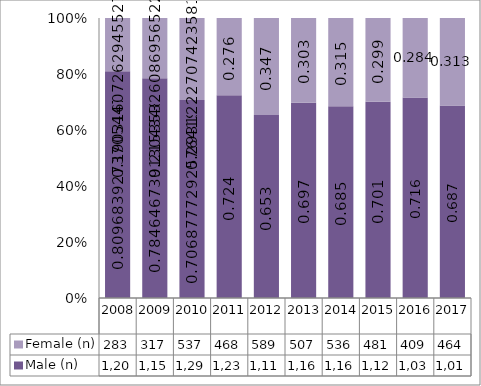
| Category | Male (n) | Female (n) |
|---|---|---|
| 2008.0 | 1204 | 283 |
| 2009.0 | 1155 | 317 |
| 2010.0 | 1295 | 537 |
| 2011.0 | 1230 | 468 |
| 2012.0 | 1110 | 589 |
| 2013.0 | 1166 | 507 |
| 2014.0 | 1164 | 536 |
| 2015.0 | 1128 | 481 |
| 2016.0 | 1031 | 409 |
| 2017.0 | 1019 | 464 |